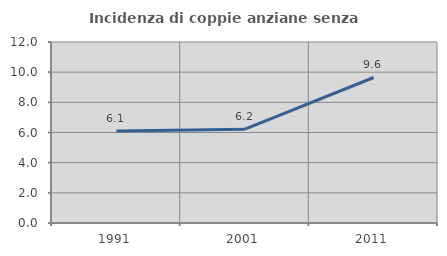
| Category | Incidenza di coppie anziane senza figli  |
|---|---|
| 1991.0 | 6.107 |
| 2001.0 | 6.223 |
| 2011.0 | 9.647 |